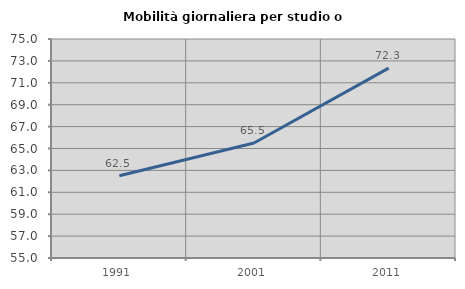
| Category | Mobilità giornaliera per studio o lavoro |
|---|---|
| 1991.0 | 62.508 |
| 2001.0 | 65.498 |
| 2011.0 | 72.344 |